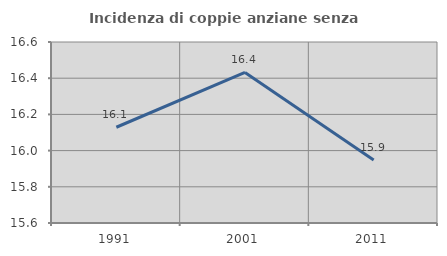
| Category | Incidenza di coppie anziane senza figli  |
|---|---|
| 1991.0 | 16.129 |
| 2001.0 | 16.432 |
| 2011.0 | 15.948 |